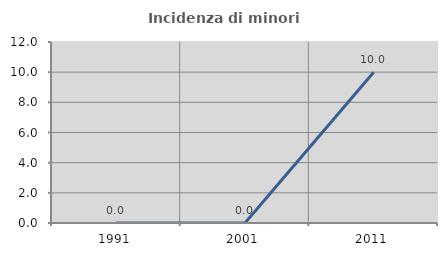
| Category | Incidenza di minori stranieri |
|---|---|
| 1991.0 | 0 |
| 2001.0 | 0 |
| 2011.0 | 10 |